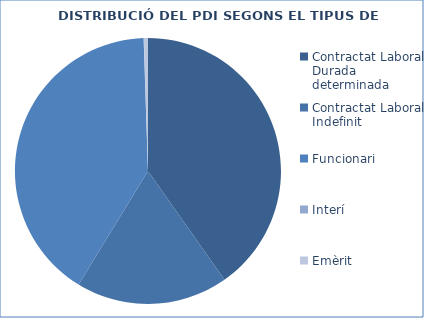
| Category | Series 0 |
|---|---|
| Contractat Laboral. Durada determinada | 1069 |
| Contractat Laboral. Indefinit | 491 |
| Funcionari | 1082 |
| Interí | 1 |
| Emèrit | 13 |